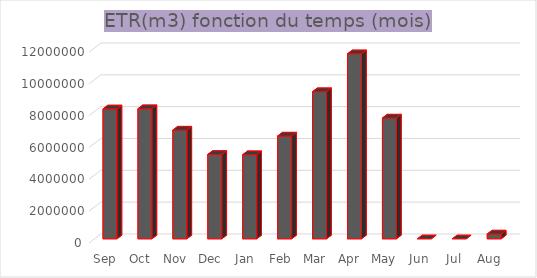
| Category | Series 0 |
|---|---|
| Sep | 8165945 |
| Oct | 8176577 |
| Nov | 6835571 |
| Dec | 5305163 |
| Jan | 5289487 |
| Feb | 6461091 |
| Mar | 9250596 |
| Apr | 11629964 |
| May | 7592667 |
| Jun | 0 |
| Jul | 0 |
| Aug | 306128 |